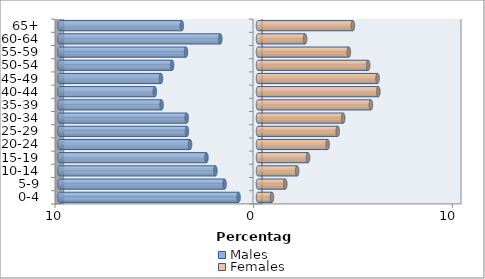
| Category | Males | Females |
|---|---|---|
| 0-4 | -0.979 | 0.703 |
| 5-9 | -1.684 | 1.373 |
| 10-14 | -2.144 | 1.97 |
| 15-19 | -2.596 | 2.519 |
| 20-24 | -3.421 | 3.507 |
| 25-29 | -3.579 | 4.013 |
| 30-34 | -3.588 | 4.288 |
| 35-39 | -4.853 | 5.683 |
| 40-44 | -5.194 | 6.058 |
| 45-49 | -4.883 | 6.018 |
| 50-54 | -4.324 | 5.547 |
| 55-59 | -3.624 | 4.574 |
| 60-64 | -1.898 | 2.372 |
| 65+ | -3.834 | 4.776 |